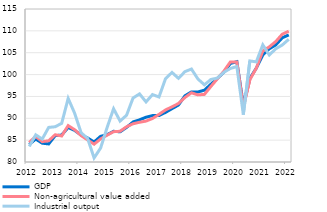
| Category | GDP | Non-agricultural value added | Industrial output |
|---|---|---|---|
| 2012 | 84.024 | 84.494 | 83.559 |
| II | 85.251 | 85.857 | 86.212 |
| III | 84.299 | 84.659 | 85.25 |
| IV | 84.139 | 84.858 | 87.916 |
| 2013 | 86.026 | 86.24 | 88.067 |
| II | 86.173 | 85.95 | 88.848 |
| III | 87.889 | 88.328 | 94.546 |
| IV | 87.227 | 87.378 | 91.152 |
| 2014 | 86.15 | 86.04 | 86.68 |
| II | 85.49 | 85.033 | 85.397 |
| III | 84.574 | 84.08 | 80.938 |
| IV | 85.877 | 85.282 | 83.197 |
| 2015 | 86.251 | 86.137 | 87.883 |
| II | 87.022 | 86.937 | 92.181 |
| III | 86.911 | 87.029 | 89.372 |
| IV | 87.906 | 88.071 | 90.695 |
| 2016 | 89.156 | 88.746 | 94.64 |
| II | 89.647 | 89.092 | 95.577 |
| III | 90.243 | 89.356 | 93.747 |
| IV | 90.611 | 89.952 | 95.427 |
| 2017 | 90.63 | 90.897 | 94.876 |
| II | 91.344 | 91.908 | 99.04 |
| III | 92.197 | 92.623 | 100.487 |
| IV | 93.033 | 93.385 | 99.149 |
| 2018 | 95.145 | 94.758 | 100.673 |
| II | 96.029 | 95.834 | 101.268 |
| III | 96.021 | 95.353 | 98.988 |
| IV | 96.431 | 95.466 | 97.655 |
| 2019 | 97.789 | 97.287 | 98.882 |
| II | 99.113 | 99.042 | 99.198 |
| III | 100.562 | 100.773 | 100.52 |
| IV | 102.537 | 102.897 | 101.4 |
| 2020 | 102.944 | 102.894 | 101.833 |
| II | 93.083 | 92.606 | 90.84 |
| III | 99.099 | 98.825 | 103.115 |
| IV | 101.471 | 101.464 | 102.907 |
| 2021 | 104.493 | 105.387 | 106.796 |
| II | 105.895 | 106.341 | 104.483 |
| III | 106.788 | 107.556 | 105.91 |
| IV | 108.412 | 109.237 | 106.765 |
| 2022 | 109.067 | 109.918 | 108.067 |